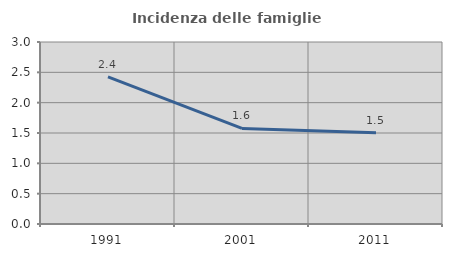
| Category | Incidenza delle famiglie numerose |
|---|---|
| 1991.0 | 2.426 |
| 2001.0 | 1.576 |
| 2011.0 | 1.504 |